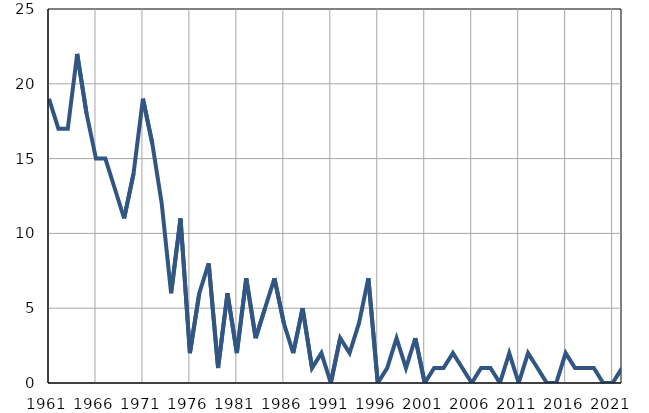
| Category | Умрла 
одојчад |
|---|---|
| 1961.0 | 19 |
| 1962.0 | 17 |
| 1963.0 | 17 |
| 1964.0 | 22 |
| 1965.0 | 18 |
| 1966.0 | 15 |
| 1967.0 | 15 |
| 1968.0 | 13 |
| 1969.0 | 11 |
| 1970.0 | 14 |
| 1971.0 | 19 |
| 1972.0 | 16 |
| 1973.0 | 12 |
| 1974.0 | 6 |
| 1975.0 | 11 |
| 1976.0 | 2 |
| 1977.0 | 6 |
| 1978.0 | 8 |
| 1979.0 | 1 |
| 1980.0 | 6 |
| 1981.0 | 2 |
| 1982.0 | 7 |
| 1983.0 | 3 |
| 1984.0 | 5 |
| 1985.0 | 7 |
| 1986.0 | 4 |
| 1987.0 | 2 |
| 1988.0 | 5 |
| 1989.0 | 1 |
| 1990.0 | 2 |
| 1991.0 | 0 |
| 1992.0 | 3 |
| 1993.0 | 2 |
| 1994.0 | 4 |
| 1995.0 | 7 |
| 1996.0 | 0 |
| 1997.0 | 1 |
| 1998.0 | 3 |
| 1999.0 | 1 |
| 2000.0 | 3 |
| 2001.0 | 0 |
| 2002.0 | 1 |
| 2003.0 | 1 |
| 2004.0 | 2 |
| 2005.0 | 1 |
| 2006.0 | 0 |
| 2007.0 | 1 |
| 2008.0 | 1 |
| 2009.0 | 0 |
| 2010.0 | 2 |
| 2011.0 | 0 |
| 2012.0 | 2 |
| 2013.0 | 1 |
| 2014.0 | 0 |
| 2015.0 | 0 |
| 2016.0 | 2 |
| 2017.0 | 1 |
| 2018.0 | 1 |
| 2019.0 | 1 |
| 2020.0 | 0 |
| 2021.0 | 0 |
| 2022.0 | 1 |